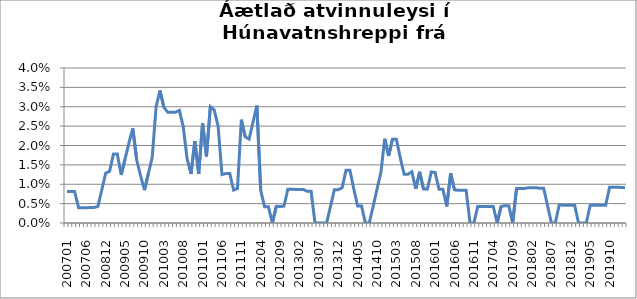
| Category | Series 0 |
|---|---|
| 200701 | 0.008 |
| 200702 | 0.008 |
| 200703 | 0.008 |
| 200704 | 0.004 |
| 200705 | 0.004 |
| 200706 | 0.004 |
| 200707 | 0.004 |
| 200708 | 0.004 |
| 200810 | 0.004 |
| 200811 | 0.009 |
| 200812 | 0.013 |
| 200901 | 0.013 |
| 200902 | 0.018 |
| 200903 | 0.018 |
| 200904 | 0.012 |
| 200905 | 0.017 |
| 200906 | 0.021 |
| 200907 | 0.024 |
| 200908 | 0.016 |
| 200909 | 0.012 |
| 200910 | 0.008 |
| 200911 | 0.013 |
| 200912 | 0.017 |
| 201001 | 0.03 |
| 201002 | 0.034 |
| 201003 | 0.03 |
| 201004 | 0.029 |
| 201005 | 0.029 |
| 201006 | 0.029 |
| 201007 | 0.029 |
| 201008 | 0.025 |
| 201009 | 0.017 |
| 201010 | 0.013 |
| 201011 | 0.021 |
| 201012 | 0.013 |
| 201101 | 0.026 |
| 201102 | 0.017 |
| 201103 | 0.03 |
| 201104 | 0.029 |
| 201105 | 0.025 |
| 201106 | 0.012 |
| 201107 | 0.013 |
| 201108 | 0.013 |
| 201109 | 0.009 |
| 201110 | 0.009 |
| 201111 | 0.027 |
| 201112 | 0.022 |
| 201201 | 0.022 |
| 201202 | 0.026 |
| 201203 | 0.03 |
| 201204 | 0.008 |
| 201205 | 0.004 |
| 201206 | 0.004 |
| 201207 | 0 |
| 201208 | 0.004 |
| 201209 | 0.004 |
| 201210 | 0.004 |
| 201211 | 0.009 |
| 201212 | 0.009 |
| 201301 | 0.009 |
| 201302 | 0.009 |
| 201303 | 0.009 |
| 201304 | 0.008 |
| 201305 | 0.008 |
| 201306 | 0 |
| 201307 | 0 |
| 201308 | 0 |
| 201309 | 0 |
| 201310 | 0.004 |
| 201311 | 0.009 |
| 201312 | 0.009 |
| 201401 | 0.009 |
| 201402 | 0.014 |
| 201403 | 0.014 |
| 201404 | 0.009 |
| 201405 | 0.004 |
| 201406 | 0.004 |
| 201407 | 0 |
| 201408 | 0 |
| 201409 | 0.004 |
| 201410 | 0.009 |
| 201411 | 0.013 |
| 201412 | 0.022 |
| 201501 | 0.017 |
| 201502 | 0.022 |
| 201503 | 0.022 |
| 201504 | 0.017 |
| 201505 | 0.013 |
| 201506 | 0.013 |
| 201507 | 0.013 |
| 201508 | 0.009 |
| 201509 | 0.013 |
| 201510 | 0.009 |
| 201511 | 0.009 |
| 201512 | 0.013 |
| 201601 | 0.013 |
| 201602 | 0.009 |
| 201603 | 0.009 |
| 201604 | 0.004 |
| 201605 | 0.013 |
| 201606 | 0.009 |
| 201607 | 0.008 |
| 201608 | 0.008 |
| 201609 | 0.008 |
| 201610 | 0 |
| 201611 | 0 |
| 201612 | 0.004 |
| 201701 | 0.004 |
| 201702 | 0.004 |
| 201703 | 0.004 |
| 201704 | 0.004 |
| 201705 | 0 |
| 201706 | 0.004 |
| 201707 | 0.004 |
| 201708 | 0.004 |
| 201709 | 0 |
| 201710 | 0.009 |
| 201711 | 0.009 |
| 201712 | 0.009 |
| 201801 | 0.009 |
| 201802 | 0.009 |
| 201803 | 0.009 |
| 201804 | 0.009 |
| 201805 | 0.009 |
| 201806 | 0.004 |
| 201807 | 0 |
| 201808 | 0 |
| 201809 | 0.005 |
| 201810 | 0.005 |
| 201811 | 0.005 |
| 201812 | 0.005 |
| 201901 | 0.005 |
| 201902 | 0 |
| 201903 | 0 |
| 201904 | 0 |
| 201905 | 0.005 |
| 201906 | 0.005 |
| 201907 | 0.005 |
| 201908 | 0.005 |
| 201909 | 0.005 |
| 201910 | 0.009 |
| 201911 | 0.009 |
| 201912 | 0.009 |
| 202001 | 0.009 |
| 202002 | 0.009 |